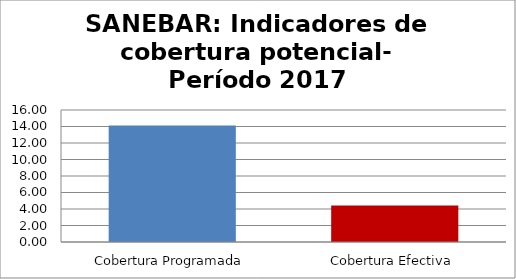
| Category | Series 0 |
|---|---|
| Cobertura Programada | 14.13 |
| Cobertura Efectiva | 4.418 |